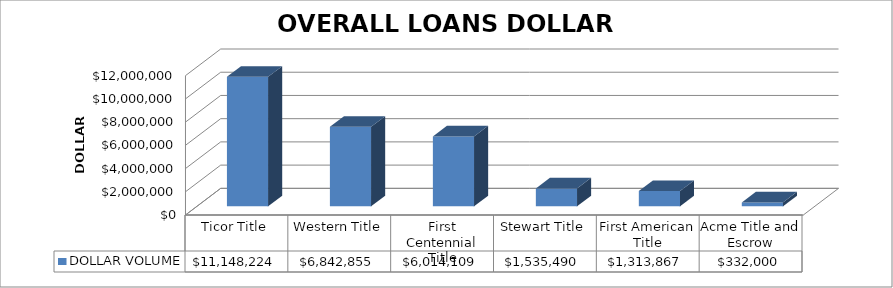
| Category | DOLLAR VOLUME |
|---|---|
| Ticor Title | 11148224 |
| Western Title | 6842855 |
| First Centennial Title | 6014109 |
| Stewart Title | 1535490 |
| First American Title | 1313867 |
| Acme Title and Escrow | 332000 |